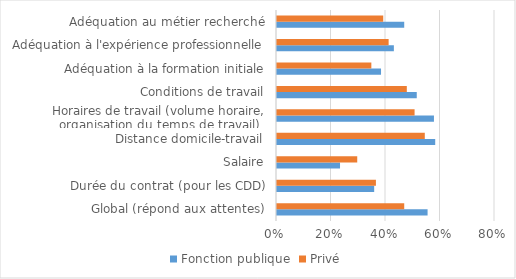
| Category | Fonction publique | Privé |
|---|---|---|
| Global (répond aux attentes) | 0.553 | 0.467 |
| Durée du contrat (pour les CDD) | 0.357 | 0.363 |
| Salaire | 0.231 | 0.294 |
| Distance domicile-travail | 0.581 | 0.542 |
| Horaires de travail (volume horaire, organisation du temps de travail) | 0.576 | 0.505 |
| Conditions de travail | 0.513 | 0.476 |
| Adéquation à la formation initiale | 0.382 | 0.346 |
| Adéquation à l'expérience professionnelle | 0.429 | 0.41 |
| Adéquation au métier recherché | 0.467 | 0.39 |